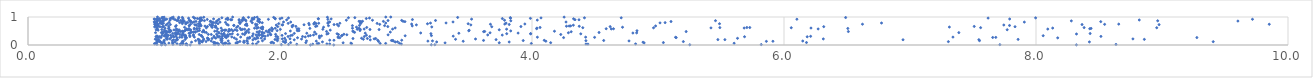
| Category | Series 0 |
|---|---|
| 2.241578945946104 | 0.001 |
| 2.426759971176793 | 0.002 |
| 1.2872069128105674 | 0.003 |
| 1.2631701502655523 | 0.004 |
| 8.320751555674372 | 0.005 |
| 1.0583924325847105 | 0.006 |
| 5.2523349750351 | 0.007 |
| 3.2008425112871373 | 0.008 |
| 3.229158893183101 | 0.009 |
| 1.0912658916119995 | 0.01 |
| 7.7133533990033545 | 0.011 |
| 2.010890504526307 | 0.012 |
| 50.19873191421325 | 0.013 |
| 1.2536540028273206 | 0.014 |
| 5.819514119680061 | 0.015 |
| 2.067765806990562 | 0.016 |
| 1.5117703901667539 | 0.017 |
| 1.207424003496214 | 0.018 |
| 1.064102342438244 | 0.019 |
| 1.210257160159444 | 0.02 |
| 8.634813253540578 | 0.021 |
| 1.0234598263853283 | 0.022 |
| 1.1504505991301899 | 0.023 |
| 13.195162578671912 | 0.024 |
| 1.4759752793500893 | 0.025 |
| 2.1330096976840323 | 0.026 |
| 1.2257277541115448 | 0.027 |
| 1.4852086224367906 | 0.028 |
| 2.260149794084783 | 0.029 |
| 1.085949907040457 | 0.03 |
| 4.444215818290673 | 0.031 |
| 1.5508420437927346 | 0.032 |
| 1.511578320611751 | 0.033 |
| 4.428578788481236 | 0.034 |
| 2.963239048578387 | 0.035 |
| 1.551490094915869 | 0.036 |
| 2.3947175451126963 | 0.037 |
| 1.0067952929091961 | 0.038 |
| 4.822104110397253 | 0.039 |
| 2.372178188229276 | 0.04 |
| 1.5883111105390662 | 0.041 |
| 1.8127985617609805 | 0.042 |
| 1.5656300615091177 | 0.043 |
| 1.182844893988606 | 0.044 |
| 1.7833207202650454 | 0.045 |
| 1.256074003803148 | 0.046 |
| 1.360942226552151 | 0.047 |
| 2.2954527707396895 | 0.048 |
| 2.5680618031354254 | 0.049 |
| 1.003904594621528 | 0.05 |
| 1.5999504683350616 | 0.051 |
| 16.922039974617455 | 0.052 |
| 3.9945782052346885 | 0.053 |
| 2.307301875399124 | 0.054 |
| 2.794912927505647 | 0.055 |
| 2.8385682186663903 | 0.056 |
| 29.256037089006174 | 0.057 |
| 1.7435041441675607 | 0.058 |
| 34.06864876100978 | 0.059 |
| 1.2304624885578006 | 0.06 |
| 1.5033032545507077 | 0.061 |
| 2.948320653457966 | 0.062 |
| 5.604247722702614 | 0.063 |
| 1.56214882009625 | 0.064 |
| 1.015541600178401 | 0.065 |
| 1.1182962540707286 | 0.066 |
| 1.1477723564848874 | 0.067 |
| 2.5625928142043017 | 0.068 |
| 1.2188776209100463 | 0.069 |
| 1.650035159258016 | 0.07 |
| 1.489650432981104 | 0.071 |
| 1.9492837424802816 | 0.072 |
| 1.5695515074345876 | 0.073 |
| 19.652979047435217 | 0.074 |
| 4.890045612627268 | 0.075 |
| 3.310096902760889 | 0.076 |
| 1.6606634178257913 | 0.077 |
| 2.501045547357235 | 0.078 |
| 3.740189222567471 | 0.079 |
| 24.34364476736399 | 0.08 |
| 1.0661555267974518 | 0.081 |
| 4.148106391566777 | 0.082 |
| 1.6586961973738166 | 0.083 |
| 1.9287221939685744 | 0.084 |
| 2.2051407270092707 | 0.085 |
| 2.0843348742267342 | 0.086 |
| 5.042739369853276 | 0.087 |
| 6.178378584180651 | 0.088 |
| 1.4808605368828305 | 0.089 |
| 1.1491125698770308 | 0.09 |
| 11.32301817452026 | 0.091 |
| 1.0543326818131804 | 0.092 |
| 2.0389634692496936 | 0.093 |
| 1.0798377728266342 | 0.094 |
| 1.53538078741684 | 0.095 |
| 1.4728068254868825 | 0.096 |
| 14.288463242025886 | 0.097 |
| 1.7167576450815947 | 0.098 |
| 2.0453070732026104 | 0.099 |
| 4.8812675264466305 | 0.1 |
| 1.7114771292230515 | 0.101 |
| 1.2979817800671 | 0.102 |
| 1.0241131724063892 | 0.103 |
| 1.9370839110490168 | 0.104 |
| 1.6655919512687074 | 0.105 |
| 1.166457976244932 | 0.106 |
| 2.915227450124975 | 0.107 |
| 3.8189099390880203 | 0.108 |
| 3.2434547920816263 | 0.109 |
| 8.423924668238275 | 0.11 |
| 2.337002338227638 | 0.111 |
| 1.3576951759346394 | 0.112 |
| 2.932423742795596 | 0.113 |
| 1.8270578497362433 | 0.114 |
| 1.3827290633594014 | 0.115 |
| 315.9405125009939 | 0.116 |
| 1.0231875278610503 | 0.117 |
| 1.3829931154784973 | 0.118 |
| 9.406533608315343 | 0.119 |
| 7.304599264926775 | 0.12 |
| 1.0474486672522987 | 0.121 |
| 5.201170105231243 | 0.122 |
| 1.0304107954277302 | 0.123 |
| 2.0252360327350294 | 0.124 |
| 1.4131399411857606 | 0.125 |
| 1.6815535610351564 | 0.126 |
| 2.782481341324616 | 0.127 |
| 1.2252194707116706 | 0.128 |
| 1.372520627104263 | 0.129 |
| 5.860229125459385 | 0.13 |
| 1.0478088144684023 | 0.131 |
| 1.7401401094504167 | 0.132 |
| 5.912134553105972 | 0.133 |
| 3.453973991855298 | 0.134 |
| 1.2326430226742646 | 0.135 |
| 4.110180671592021 | 0.136 |
| 30.96781560435631 | 0.137 |
| 2.2880344753904787 | 0.138 |
| 3.173903499075573 | 0.139 |
| 1.713591996622383 | 0.14 |
| 1.4542281575560472 | 0.141 |
| 6.148913083090953 | 0.142 |
| 1.0805028513456778 | 0.143 |
| 2.898707400257579 | 0.144 |
| 4.76999061134949 | 0.145 |
| 1.589279487209682 | 0.146 |
| 3.210103609329709 | 0.147 |
| 2.2103926321197136 | 0.148 |
| 1.539610572035262 | 0.149 |
| 12.680832238426122 | 0.15 |
| 1.8607416474073246 | 0.151 |
| 1.3299321408951414 | 0.152 |
| 1.9794214058089024 | 0.153 |
| 4.427950127714319 | 0.154 |
| 7.55156369182974 | 0.155 |
| 1.144271571972863 | 0.156 |
| 1.7365176288792192 | 0.157 |
| 3.930291142854737 | 0.158 |
| 1.03154126560061 | 0.159 |
| 2.8842976641002105 | 0.16 |
| 4.569034150588095 | 0.161 |
| 41.219547506348405 | 0.162 |
| 2.8945440332760475 | 0.163 |
| 3.6154542057263988 | 0.164 |
| 21.77388830740093 | 0.165 |
| 1.0805706572554266 | 0.166 |
| 4.097215089048692 | 0.167 |
| 2.7756978314723004 | 0.168 |
| 14.463917597014007 | 0.169 |
| 2.4281227256562956 | 0.17 |
| 2.966143795803339 | 0.171 |
| 2.394644446710003 | 0.172 |
| 2.0449054457597255 | 0.173 |
| 1.5304904998232234 | 0.174 |
| 1.1809142081598971 | 0.175 |
| 1.3921465388980987 | 0.176 |
| 1.022985993596122 | 0.177 |
| 1.1759780638923443 | 0.178 |
| 22.52546003630022 | 0.179 |
| 1.359627317873768 | 0.18 |
| 1.784653199381436 | 0.181 |
| 1.3543656152003944 | 0.182 |
| 2.7165147219747747 | 0.183 |
| 1.1560173174245445 | 0.184 |
| 2.1130493411798152 | 0.185 |
| 1.4326731775646167 | 0.186 |
| 6.944688669721129 | 0.187 |
| 10.523389172362885 | 0.188 |
| 1.4290518951367441 | 0.189 |
| 7.546542393605476 | 0.19 |
| 5.530965268879547 | 0.191 |
| 3.7149273978000714 | 0.192 |
| 5.475291454777098 | 0.193 |
| 1.186339158185072 | 0.194 |
| 1.9778364711136769 | 0.195 |
| 1.0212242633380324 | 0.196 |
| 1.960450261560182 | 0.197 |
| 1.2472832165452663 | 0.198 |
| 27.97029722714315 | 0.199 |
| 7.857933109102419 | 0.2 |
| 8.8598750510938 | 0.201 |
| 1.0383777853455118 | 0.202 |
| 1.4341928572968294 | 0.203 |
| 3.3933764177464876 | 0.204 |
| 2.661505719278479 | 0.205 |
| 1.3500132242380036 | 0.206 |
| 1.6541470289690585 | 0.207 |
| 1.0102922181910825 | 0.208 |
| 11.826309457727652 | 0.209 |
| 1.3947263334526605 | 0.21 |
| 1.1058201961613043 | 0.211 |
| 2.1709992285799076 | 0.212 |
| 1.1016447388418136 | 0.213 |
| 3.551872854629434 | 0.214 |
| 1.8778541450536481 | 0.215 |
| 1.8069939929287875 | 0.216 |
| 6.312054173989709 | 0.217 |
| 8.769333324877406 | 0.218 |
| 2.018445814113565 | 0.219 |
| 2.747239283032129 | 0.22 |
| 2.079497799555715 | 0.221 |
| 1.126030440542902 | 0.222 |
| 18.045375652783367 | 0.223 |
| 1.5304877537751138 | 0.224 |
| 34.568027385496684 | 0.225 |
| 14.209966877988537 | 0.226 |
| 16.997074292879475 | 0.227 |
| 1.5373234238025286 | 0.228 |
| 1.5420706171874334 | 0.229 |
| 2.7597097404085984 | 0.23 |
| 2.579224270434571 | 0.231 |
| 1.4607282173096445 | 0.232 |
| 2.6931422332957284 | 0.233 |
| 1.428367107289882 | 0.234 |
| 1.982595705433059 | 0.235 |
| 1.7959930592209044 | 0.236 |
| 1.0973523893897148 | 0.237 |
| 5.631099313612223 | 0.238 |
| 13.871942037728546 | 0.239 |
| 37.99783788422421 | 0.24 |
| 2.037330892783408 | 0.241 |
| 2.6473980937862254 | 0.242 |
| 1.7497983673888973 | 0.243 |
| 1.4904790244926645 | 0.244 |
| 1.850345638519614 | 0.245 |
| 1.8242464889377852 | 0.246 |
| 1.7581554714797423 | 0.247 |
| 1.742542503680825 | 0.248 |
| 12.661911161431837 | 0.249 |
| 1.4245540765668383 | 0.25 |
| 1.1828445572543993 | 0.251 |
| 25.81402460807473 | 0.252 |
| 1.6374384821490366 | 0.253 |
| 21.722036073636964 | 0.254 |
| 8.172250674215858 | 0.255 |
| 2.3134891974460174 | 0.256 |
| 1.1045274827017497 | 0.257 |
| 1.2583112346711909 | 0.258 |
| 2.1391912606380186 | 0.259 |
| 2.4748293870171203 | 0.26 |
| 1.5737351892938818 | 0.261 |
| 1.2511368052637935 | 0.262 |
| 5.144479643358682 | 0.263 |
| 4.25073086501913 | 0.264 |
| 2.461903520593512 | 0.265 |
| 9.276853890850184 | 0.266 |
| 10.342338088006748 | 0.267 |
| 1.0557623698935992 | 0.268 |
| 7.656343473767365 | 0.269 |
| 1.0297332732873874 | 0.27 |
| 1.7597975202437286 | 0.271 |
| 7.6808899314185854 | 0.272 |
| 4.496685044033712 | 0.273 |
| 1.1376108154213178 | 0.274 |
| 5.139481896144497 | 0.275 |
| 1.2220632340642907 | 0.276 |
| 1.2042345398544005 | 0.277 |
| 1.4781328399992193 | 0.278 |
| 4.042726732558227 | 0.279 |
| 4.425825094563069 | 0.28 |
| 1.3861679582345854 | 0.281 |
| 7.341021290860612 | 0.282 |
| 1.3203698617346684 | 0.283 |
| 1.6878349202079714 | 0.284 |
| 1.8172691089716193 | 0.285 |
| 1.5089631954671985 | 0.286 |
| 1.1583105413809405 | 0.287 |
| 2.2008366876772194 | 0.288 |
| 1.6170463662874959 | 0.289 |
| 1.2473652642509836 | 0.29 |
| 1.5735402600416661 | 0.291 |
| 2.461435486394946 | 0.292 |
| 1.5631301022408153 | 0.293 |
| 6.184204490677558 | 0.294 |
| 1.9803559587365385 | 0.295 |
| 5.686882717979698 | 0.296 |
| 1.015187688312971 | 0.297 |
| 1.0305712240011902 | 0.298 |
| 1.0445198898313626 | 0.299 |
| 1.2851415927498588 | 0.3 |
| 2.7127621260044816 | 0.301 |
| 2.669279628235043 | 0.302 |
| 2.1792758923581648 | 0.303 |
| 2.0641511828380374 | 0.304 |
| 1.521334947652717 | 0.305 |
| 1.9677585612472561 | 0.306 |
| 8.515454020819718 | 0.307 |
| 1.8822194264999932 | 0.308 |
| 1.8615887635484183 | 0.309 |
| 6.211394505854669 | 0.31 |
| 1.5416827407065552 | 0.311 |
| 222.47859723426097 | 0.312 |
| 1.5876606901769892 | 0.313 |
| 1.174574949706975 | 0.314 |
| 1.475245811018593 | 0.315 |
| 3.3747194159716507 | 0.316 |
| 1.0887517960106035 | 0.317 |
| 2.312228804988674 | 0.318 |
| 1.251563000600865 | 0.319 |
| 1.5038814847561695 | 0.32 |
| 1.1026852769241464 | 0.321 |
| 2.225165928838119 | 0.322 |
| 1.7811953815149157 | 0.323 |
| 1.023280588115598 | 0.324 |
| 1.0812544153385168 | 0.325 |
| 2.3287694755284485 | 0.326 |
| 1.152356059969554 | 0.327 |
| 2.4883364501345984 | 0.328 |
| 2.9933223601619066 | 0.329 |
| 1.5709260867979304 | 0.33 |
| 1.3129969897683764 | 0.331 |
| 8.057013451502012 | 0.332 |
| 1.3747471368297808 | 0.333 |
| 2.0837920697533785 | 0.334 |
| 3.202033843955892 | 0.335 |
| 1.8666356470863328 | 0.336 |
| 2.240801536671383 | 0.337 |
| 1.3766948843006634 | 0.338 |
| 1.284084925670883 | 0.339 |
| 1.0626810179198043 | 0.34 |
| 1.1136152822530183 | 0.341 |
| 1.9041291446405035 | 0.342 |
| 2.016360263534676 | 0.343 |
| 2.4936648984635306 | 0.344 |
| 1.2204516872044509 | 0.345 |
| 954.350037426929 | 0.346 |
| 1.2492051411307168 | 0.347 |
| 1.8365114072487763 | 0.348 |
| 2.685748991788226 | 0.349 |
| 1.1322420640223216 | 0.35 |
| 12.657415038546187 | 0.351 |
| 2.0977905590843737 | 0.352 |
| 1.2360323693348936 | 0.353 |
| 3.763932626525988 | 0.354 |
| 67.77356711913288 | 0.355 |
| 1.8279933316603978 | 0.356 |
| 2.2657948473350187 | 0.357 |
| 46.19616094633234 | 0.358 |
| 11.255419469976733 | 0.359 |
| 3.648618633102158 | 0.36 |
| 12.856850414398215 | 0.361 |
| 1.8095405052678524 | 0.362 |
| 2.8579070746192623 | 0.363 |
| 1.927395784445666 | 0.364 |
| 1.5505380689187953 | 0.365 |
| 2.5306481265712226 | 0.366 |
| 1.1016097073062534 | 0.367 |
| 1.8533323673568034 | 0.368 |
| 1.3133151179935194 | 0.369 |
| 1.5856041136107677 | 0.37 |
| 21.287120869517192 | 0.371 |
| 1.6647809052632767 | 0.372 |
| 1.7187523544747012 | 0.373 |
| 2.464234694266321 | 0.374 |
| 1.3593453532041009 | 0.375 |
| 4.228355862487969 | 0.376 |
| 1.4544728261001085 | 0.377 |
| 1.089729307159169 | 0.378 |
| 1.2050581326366756 | 0.379 |
| 1.4309275697959578 | 0.38 |
| 1.9651663294918098 | 0.381 |
| 1.5575775438758601 | 0.382 |
| 1.602805814591775 | 0.383 |
| 449.46277261798593 | 0.384 |
| 14.019056174182634 | 0.385 |
| 2.5074362413344735 | 0.386 |
| 1.1763933923757708 | 0.387 |
| 1.496700163501671 | 0.388 |
| 1.9237848656869276 | 0.389 |
| 2.3719823337958554 | 0.39 |
| 1.2307240681906095 | 0.391 |
| 1.1699651500053816 | 0.392 |
| 8.321233662691105 | 0.393 |
| 1.1851448505553188 | 0.394 |
| 2.2864111475323172 | 0.395 |
| 1.7031054032689763 | 0.396 |
| 1.0975725818213935 | 0.397 |
| 4.38715458688762 | 0.398 |
| 1.7866787093660408 | 0.399 |
| 1.6213430440705927 | 0.4 |
| 3.989040583007793 | 0.401 |
| 1.5349774761791168 | 0.402 |
| 2.4530389924318916 | 0.403 |
| 3.7993678074566146 | 0.404 |
| 3.197873621818967 | 0.405 |
| 3.989187714598837 | 0.406 |
| 2.0440118391999555 | 0.407 |
| 1.0686500233173508 | 0.408 |
| 1.1792902500868503 | 0.409 |
| 8.429738750930138 | 0.41 |
| 2.3821204624101284 | 0.411 |
| 1.1490310526940712 | 0.412 |
| 1.2284173610441689 | 0.413 |
| 52.78122293630901 | 0.414 |
| 2.1135727760606398 | 0.415 |
| 20.98050190751163 | 0.416 |
| 1.5548514726190519 | 0.417 |
| 1.2780873245710376 | 0.418 |
| 3.4195649007713356 | 0.419 |
| 35.37058652232841 | 0.42 |
| 2.21269094389322 | 0.421 |
| 1.285025009335026 | 0.422 |
| 1.5148627611054197 | 0.423 |
| 2.6765472059039386 | 0.424 |
| 1.191522477257588 | 0.425 |
| 3.889795784328582 | 0.426 |
| 1.8315827069966368 | 0.427 |
| 4.8008102832677535 | 0.428 |
| 11.474429085101676 | 0.429 |
| 3.116633808979 | 0.43 |
| 1.8740806578445526 | 0.431 |
| 1.7296892935843873 | 0.432 |
| 4.830570119008707 | 0.433 |
| 15.748739109441363 | 0.434 |
| 13.759840579811558 | 0.435 |
| 3.6671221738582207 | 0.436 |
| 4.288826963327457 | 0.437 |
| 1.1699987849729219 | 0.438 |
| 1.0707979292988314 | 0.439 |
| 1.0120909952354247 | 0.44 |
| 1.0584553431427404 | 0.441 |
| 7.387628691472769 | 0.442 |
| 1.8558953514786665 | 0.443 |
| 14.44651851612584 | 0.444 |
| 10.545458924895243 | 0.445 |
| 1.4151966367355882 | 0.446 |
| 4.532155612873871 | 0.447 |
| 1.2900487519821777 | 0.448 |
| 1.752341938112793 | 0.449 |
| 1.8609499736728992 | 0.45 |
| 1.5138035729471695 | 0.451 |
| 2.591958504761164 | 0.452 |
| 1.7265846145425587 | 0.453 |
| 1.905363761469129 | 0.454 |
| 65.370924551353 | 0.455 |
| 1.3004706583190884 | 0.456 |
| 1.100402911199 | 0.457 |
| 1.3269942870217568 | 0.458 |
| 1.9156598544251724 | 0.459 |
| 2.274671041464151 | 0.46 |
| 2.8755464383380054 | 0.461 |
| 1.12341170807721 | 0.462 |
| 1.4000830881133328 | 0.463 |
| 1.0681927635162685 | 0.464 |
| 1.3145132367247796 | 0.465 |
| 1.8181508080289397 | 0.466 |
| 258.0624215053049 | 0.467 |
| 25.15131639923706 | 0.468 |
| 1.3842482279560118 | 0.469 |
| 46.17430687312535 | 0.47 |
| 1.3289885066080567 | 0.471 |
| 1.104481374848459 | 0.472 |
| 4.310934977478623 | 0.473 |
| 1.1166324786484503 | 0.474 |
| 2.583937982169252 | 0.475 |
| 1.2329030352146366 | 0.476 |
| 3.615872835993812 | 0.477 |
| 1.2091481706106586 | 0.478 |
| 1.0844453063939827 | 0.479 |
| 5.223488138984881 | 0.48 |
| 6.510858683239888 | 0.481 |
| 1.1931000702258392 | 0.482 |
| 3.6247082879885957 | 0.483 |
| 2.3696072494759695 | 0.484 |
| 1.5900780546229167 | 0.485 |
| 1.2225728312708646 | 0.486 |
| 1.0914302971456915 | 0.487 |
| 1.1326861817423695 | 0.488 |
| 1.0973770935796985 | 0.489 |
| 1.83749320478334 | 0.49 |
| 1.2274135685881309 | 0.491 |
| 4.178171317264202 | 0.492 |
| 1.4818892076589167 | 0.493 |
| 1.499824123035733 | 0.494 |
| 1.3936406257053087 | 0.495 |
| 2.5775363823035247 | 0.496 |
| 1.3464870042186623 | 0.497 |
| 1.8904364355510808 | 0.498 |
| 1.6267228171544283 | 0.499 |
| 2.082296695169466 | 0.5 |
| 1.2421875274572214 | 0.501 |
| 1.736985407520652 | 0.502 |
| 3.831109698448022 | 0.503 |
| 11.410285029566737 | 0.504 |
| 1.936453752549187 | 0.505 |
| 1.5367234439415893 | 0.506 |
| 3.498528012297061 | 0.507 |
| 1.134093128228286 | 0.508 |
| 2.1502275622041482 | 0.509 |
| 4.83318393345509 | 0.51 |
| 10.857941087219547 | 0.511 |
| 2.1374391910182626 | 0.512 |
| 1.6006761833980026 | 0.513 |
| 1.977120339973568 | 0.514 |
| 2.634736391846923 | 0.515 |
| 31.44659156328469 | 0.516 |
| 69.36613966796327 | 0.517 |
| 1.6591889242253641 | 0.518 |
| 103.06469216109765 | 0.519 |
| 1.3610102822196397 | 0.52 |
| 1.176960869979283 | 0.521 |
| 1.1291561833246615 | 0.522 |
| 1.911504191371832 | 0.523 |
| 1.3927552318030851 | 0.524 |
| 1.5595810528007226 | 0.525 |
| 1.2482173056123622 | 0.526 |
| 3.5011793583967834 | 0.527 |
| 1.5444726784681937 | 0.528 |
| 1.0326072848439314 | 0.529 |
| 1.5641231605383403 | 0.53 |
| 2.398887846476906 | 0.531 |
| 91.4037342155743 | 0.532 |
| 1.0825122348046983 | 0.533 |
| 1.5707056630422647 | 0.534 |
| 1.287061889676077 | 0.535 |
| 1.2695501785283267 | 0.536 |
| 1.2005137469318252 | 0.537 |
| 1.158844446594108 | 0.538 |
| 1.2916809085535086 | 0.539 |
| 1.1905192372419109 | 0.54 |
| 1.0172323472260147 | 0.541 |
| 1.1234067751663384 | 0.542 |
| 3.740033908536719 | 0.543 |
| 1.64308163494589 | 0.544 |
| 7.771299107370565 | 0.545 |
| 1.6912184147839144 | 0.546 |
| 1.2558173480295056 | 0.547 |
| 47.06374071056184 | 0.548 |
| 1.614925467069492 | 0.549 |
| 1.9199392967986102 | 0.55 |
| 1.0617809782481844 | 0.551 |
| 2.7865414803036863 | 0.552 |
| 2.7140974200886125 | 0.553 |
| 618.8942651159871 | 0.554 |
| 1.7520029967024993 | 0.555 |
| 1.5960131351554956 | 0.556 |
| 2.6376521848343386 | 0.557 |
| 2.0027579552043906 | 0.558 |
| 1.7031821194265186 | 0.559 |
| 1.0288865264382798 | 0.56 |
| 2.340074046805521 | 0.561 |
| 2.612959744428391 | 0.562 |
| 13.69975953749935 | 0.563 |
| 1.7194935529120803 | 0.564 |
| 3.7983636920447705 | 0.565 |
| 1.8612927850478311 | 0.566 |
| 1.9417995275645021 | 0.567 |
| 2.8934495956567634 | 0.568 |
| 8.093502414498712 | 0.569 |
| 1.3197834759813807 | 0.57 |
| 2.667956697799121 | 0.571 |
| 1.3387564448199643 | 0.572 |
| 6.270997813028308 | 0.573 |
| 4.629220887631744 | 0.574 |
| 1.178186904679818 | 0.575 |
| 1.258623786491217 | 0.576 |
| 1.5041222125886944 | 0.577 |
| 2.1357888587061957 | 0.578 |
| 4.646718349538695 | 0.579 |
| 2.149564416801012 | 0.58 |
| 4.58876012461492 | 0.581 |
| 8.426731687786125 | 0.582 |
| 4.036760094969645 | 0.583 |
| 1.859141254919239 | 0.584 |
| 53.20093658245231 | 0.585 |
| 1.2773374533288164 | 0.586 |
| 1.114870726396627 | 0.587 |
| 1.359583854189725 | 0.588 |
| 35.40772699260363 | 0.589 |
| 1.3407756776730797 | 0.59 |
| 6.506631461017884 | 0.591 |
| 8.437103345668111 | 0.592 |
| 2.2372345173066552 | 0.593 |
| 1.6835244141641736 | 0.594 |
| 1.8163522697539582 | 0.595 |
| 1.3195334095555642 | 0.596 |
| 2.626893779200524 | 0.597 |
| 1.9622074068525708 | 0.598 |
| 1.0874424102852942 | 0.599 |
| 2.5753134022785025 | 0.6 |
| 1.7981350230384616 | 0.601 |
| 1.0223670200459216 | 0.602 |
| 1.532858217344864 | 0.603 |
| 8.13239887614177 | 0.604 |
| 4.03930830231159 | 0.605 |
| 6.214235140988989 | 0.606 |
| 5.683748670839552 | 0.607 |
| 1.8473968125690525 | 0.608 |
| 1.93411384721362 | 0.609 |
| 2.9141531043662527 | 0.61 |
| 5.420440630423979 | 0.611 |
| 1.1189713898960063 | 0.612 |
| 4.96462268829103 | 0.613 |
| 1.415429979618498 | 0.614 |
| 16.184202190763326 | 0.615 |
| 6.057706570132798 | 0.616 |
| 8.958184426775501 | 0.617 |
| 4.403265418967338 | 0.618 |
| 7.560566450754984 | 0.619 |
| 18.585649005835222 | 0.62 |
| 5.490943105747998 | 0.621 |
| 8.381859582748687 | 0.622 |
| 5.72854774349844 | 0.623 |
| 1.825661250359211 | 0.624 |
| 5.705433116611426 | 0.625 |
| 4.064124790958699 | 0.626 |
| 2.6883789334154864 | 0.627 |
| 1.4618161133045426 | 0.628 |
| 27.968410872209176 | 0.629 |
| 1.8629750570624082 | 0.63 |
| 1.655960686078448 | 0.631 |
| 1.2426579694042468 | 0.632 |
| 21.472469317319334 | 0.633 |
| 4.718547899331978 | 0.634 |
| 10.468586979533336 | 0.635 |
| 2.345807779237798 | 0.636 |
| 1.4862352327237345 | 0.637 |
| 2.6071192722645327 | 0.638 |
| 1.021150470492697 | 0.639 |
| 36.351160894717225 | 0.64 |
| 7.3126213279732175 | 0.641 |
| 1.492137670929958 | 0.642 |
| 1.8602353646389274 | 0.643 |
| 60.63318882494365 | 0.644 |
| 3.204733746132459 | 0.645 |
| 50.63117109629223 | 0.646 |
| 1.0049473839605267 | 0.647 |
| 1.0700573163686269 | 0.648 |
| 1.066438525141431 | 0.649 |
| 12.61791082305382 | 0.65 |
| 2.096940338522089 | 0.651 |
| 3.6807671802962965 | 0.652 |
| 1.0481410315252015 | 0.653 |
| 7.833636367179537 | 0.654 |
| 6.3154287381748775 | 0.655 |
| 1.9817236082951193 | 0.656 |
| 4.620205194622324 | 0.657 |
| 2.8557145474256487 | 0.658 |
| 3.9120168300397946 | 0.659 |
| 1.4242849148106829 | 0.66 |
| 1.4567156507089796 | 0.661 |
| 1.1709640901036036 | 0.662 |
| 2.282274558650305 | 0.663 |
| 7.509714236080297 | 0.664 |
| 2.126064474969904 | 0.665 |
| 12.479880023154045 | 0.666 |
| 1.0360816528275385 | 0.667 |
| 1.0752620077401722 | 0.668 |
| 4.374976338157038 | 0.669 |
| 1.6662850211510705 | 0.67 |
| 4.273561905746814 | 0.671 |
| 10.119284598962484 | 0.672 |
| 1.3534107670305255 | 0.673 |
| 1.1161697677958602 | 0.674 |
| 14.685276357214926 | 0.675 |
| 1.4048122827801184 | 0.676 |
| 2.292852590675656 | 0.677 |
| 4.294770282393349 | 0.678 |
| 46.636488471071 | 0.679 |
| 4.980939239467178 | 0.68 |
| 4.306609684726484 | 0.681 |
| 3.0495965298023986 | 0.682 |
| 1.3672664260216127 | 0.683 |
| 2.464549895219879 | 0.684 |
| 1.8101410503355297 | 0.685 |
| 1.2796619962615847 | 0.686 |
| 1.3739297610174892 | 0.687 |
| 2.0969900179489094 | 0.688 |
| 1.487925480151955 | 0.689 |
| 2.384871039047925 | 0.69 |
| 2.830179512383738 | 0.691 |
| 2.574839800971848 | 0.692 |
| 1.1765180216248214 | 0.693 |
| 1.0124782468309363 | 0.694 |
| 1.2803715100400272 | 0.695 |
| 1.6330854479557795 | 0.696 |
| 1.7380687089097961 | 0.697 |
| 7.789854924074679 | 0.698 |
| 2.6305724412011844 | 0.699 |
| 1.4675406545336918 | 0.7 |
| 1.4578847388796508 | 0.701 |
| 1.3355454642625015 | 0.702 |
| 2.104004894942781 | 0.703 |
| 10.128093983604481 | 0.704 |
| 1.6342682421485486 | 0.705 |
| 16.4342901201447 | 0.706 |
| 4.328146092386389 | 0.707 |
| 83.44374712626008 | 0.708 |
| 1.0319922247836943 | 0.709 |
| 1.0948929094537274 | 0.71 |
| 1.5889808309333373 | 0.711 |
| 1.9702775349643367 | 0.712 |
| 1.0240993803514995 | 0.713 |
| 7.744692555387317 | 0.714 |
| 53.73882489164866 | 0.715 |
| 1.7252009135171196 | 0.716 |
| 3.5147236059827973 | 0.717 |
| 3.082428673751191 | 0.718 |
| 2.021302441014699 | 0.719 |
| 2.0168441583326033 | 0.72 |
| 2.2319532413025382 | 0.721 |
| 1.3339965408262313 | 0.722 |
| 2.190775877957194 | 0.723 |
| 1.3238235483879575 | 0.724 |
| 1.732745546215308 | 0.725 |
| 1.4431226442146832 | 0.726 |
| 8.976829260989836 | 0.727 |
| 1.818203464401669 | 0.728 |
| 2.429064689881514 | 0.729 |
| 8.365462229943066 | 0.73 |
| 1.129879868935262 | 0.731 |
| 1.3672623787347622 | 0.732 |
| 3.819071215108864 | 0.733 |
| 1.0327997180187705 | 0.734 |
| 2.4534471704666627 | 0.735 |
| 1.0057802295809637 | 0.736 |
| 2.7914270335277345 | 0.737 |
| 8.544701390061109 | 0.738 |
| 1.5778445559442982 | 0.739 |
| 9.851436499322062 | 0.74 |
| 3.670098991346285 | 0.741 |
| 1.2900684588789426 | 0.742 |
| 6.622743255269863 | 0.743 |
| 1.8060464295844165 | 0.744 |
| 40.28720739956167 | 0.745 |
| 8.656628694736003 | 0.746 |
| 3.7840041013980295 | 0.747 |
| 3.0446961302938855 | 0.748 |
| 15.699914222811872 | 0.749 |
| 3.943298476616974 | 0.75 |
| 2.2683063370323358 | 0.751 |
| 1.4602653685308595 | 0.752 |
| 1.2518746624829868 | 0.753 |
| 1.1063228882074045 | 0.754 |
| 1.7345893355700597 | 0.755 |
| 1.0642956901623815 | 0.756 |
| 1.3644192488249323 | 0.757 |
| 3.170497293442901 | 0.758 |
| 3.493317848437993 | 0.759 |
| 5.488296666092975 | 0.76 |
| 1.5083836892339948 | 0.761 |
| 1.3524125443487636 | 0.762 |
| 1.9894544134125438 | 0.763 |
| 1.225128381422235 | 0.764 |
| 2.2860710582722428 | 0.765 |
| 1.6820385658325776 | 0.766 |
| 2.271867684761987 | 0.767 |
| 1.065702978365067 | 0.768 |
| 2.6409640619660673 | 0.769 |
| 1.0083045427809723 | 0.77 |
| 2.7708467568508146 | 0.771 |
| 2.2284812270907226 | 0.772 |
| 2.0649491013846863 | 0.773 |
| 2.3802882661978124 | 0.774 |
| 1.0656302461951348 | 0.775 |
| 2.4750178309635293 | 0.776 |
| 2.3071019851489196 | 0.777 |
| 1.0481050363837126 | 0.778 |
| 1.0748060128971009 | 0.779 |
| 3.794006395882641 | 0.78 |
| 14.295692630601986 | 0.781 |
| 1.02419699688348 | 0.782 |
| 3.194230481888908 | 0.783 |
| 2.8391847335356126 | 0.784 |
| 6.7740722139428895 | 0.785 |
| 1.2514039271652315 | 0.786 |
| 3.3178764475461873 | 0.787 |
| 1.0530555732787668 | 0.788 |
| 26.788515876465667 | 0.789 |
| 5.016082837656413 | 0.79 |
| 49.44011189032796 | 0.791 |
| 1.4931922212127604 | 0.792 |
| 2.6367935806566662 | 0.793 |
| 1.257486438986437 | 0.794 |
| 1.8589865973780153 | 0.795 |
| 1.7796784027352905 | 0.796 |
| 1.3055917117770672 | 0.797 |
| 1.2035074802161327 | 0.798 |
| 5.056497155778828 | 0.799 |
| 1.474672885014624 | 0.8 |
| 129.60767099021575 | 0.801 |
| 2.2751187240615196 | 0.802 |
| 2.3819709848483024 | 0.803 |
| 1.2683568644816867 | 0.804 |
| 1.1195954728152522 | 0.805 |
| 1.8382723406152521 | 0.806 |
| 19.84735546392473 | 0.807 |
| 1.5675234284091477 | 0.808 |
| 1.6772500707003464 | 0.809 |
| 1.6870895586222914 | 0.81 |
| 1.008825201866005 | 0.811 |
| 48.40027931482256 | 0.812 |
| 10.349862919759218 | 0.813 |
| 27.13228738722817 | 0.814 |
| 1.2215381910108072 | 0.815 |
| 1.5241123191941073 | 0.816 |
| 2.644452497663819 | 0.817 |
| 7.907518667790685 | 0.818 |
| 2.085095087850212 | 0.819 |
| 1.4604599994120282 | 0.82 |
| 4.270096289546036 | 0.821 |
| 2.0281133060870133 | 0.822 |
| 3.373213797660902 | 0.823 |
| 2.3943940985512406 | 0.824 |
| 1.0016775176418962 | 0.825 |
| 1.2902724081908017 | 0.826 |
| 23.2326418662063 | 0.827 |
| 1.0508466716346432 | 0.828 |
| 23.060890838446454 | 0.829 |
| 1.3181643312729838 | 0.83 |
| 1.8367431651559403 | 0.831 |
| 1.232467229897339 | 0.832 |
| 49.67356128927061 | 0.833 |
| 8.513962151172478 | 0.834 |
| 2.99172531920873 | 0.835 |
| 1.018486225334609 | 0.836 |
| 1.3635780597002098 | 0.837 |
| 5.103345514864781 | 0.838 |
| 1.0641545165209774 | 0.839 |
| 2.6396721318655705 | 0.84 |
| 1.3332657283611284 | 0.841 |
| 1.4464872101373745 | 0.842 |
| 1.0264960185832683 | 0.843 |
| 2.820586540921889 | 0.844 |
| 2.976959889861392 | 0.845 |
| 1.3650221541642222 | 0.846 |
| 1.4493044420521979 | 0.847 |
| 2.654903627724682 | 0.848 |
| 2.6274181765417697 | 0.849 |
| 1.4961102905648576 | 0.85 |
| 1.7699808644749675 | 0.851 |
| 1.240387476379154 | 0.852 |
| 1.0724428487942734 | 0.853 |
| 12.457277872107992 | 0.854 |
| 9.602515573344052 | 0.855 |
| 1.8227552216854406 | 0.856 |
| 1.2891136652798776 | 0.857 |
| 1.2900568582342045 | 0.858 |
| 1.2265184538586913 | 0.859 |
| 104.5966194361669 | 0.86 |
| 8.280482567891893 | 0.861 |
| 1.729899967667613 | 0.862 |
| 3.8319202420482226 | 0.863 |
| 8.965791575055768 | 0.864 |
| 1.7013978264101342 | 0.865 |
| 30.758675811488292 | 0.866 |
| 1.07134154641405 | 0.867 |
| 1.0726141908333418 | 0.868 |
| 5.456369765710033 | 0.869 |
| 1.4002281273814432 | 0.87 |
| 92.50448251169178 | 0.871 |
| 1.1824856503833072 | 0.872 |
| 2.857274691365011 | 0.873 |
| 1.1914333750195096 | 0.874 |
| 1.2114354432549703 | 0.875 |
| 3.234405254738623 | 0.876 |
| 55.16019694938418 | 0.877 |
| 1.5063344720746568 | 0.878 |
| 2.9659124222400117 | 0.879 |
| 1.029184927596122 | 0.88 |
| 18.377487009010615 | 0.881 |
| 1.6766016852500218 | 0.882 |
| 1.1267046802136298 | 0.883 |
| 2.7338005637921396 | 0.884 |
| 3.7819078874543823 | 0.885 |
| 2.5265344142347335 | 0.886 |
| 1.278562498241618 | 0.887 |
| 1.3807357811834347 | 0.888 |
| 4.041948064437257 | 0.889 |
| 1.024897694808277 | 0.89 |
| 1.0480668581278174 | 0.891 |
| 1.083433856918638 | 0.892 |
| 8.819666567437984 | 0.893 |
| 1.3759309110415323 | 0.894 |
| 1.72555969763876 | 0.895 |
| 29.166881145059616 | 0.896 |
| 2.0524885172970055 | 0.897 |
| 1.699564725630985 | 0.898 |
| 1.024055731258409 | 0.899 |
| 4.373015116769715 | 0.9 |
| 1.2293660155619364 | 0.901 |
| 1.6168666307206379 | 0.902 |
| 4.341275624248925 | 0.903 |
| 1.6084768067637292 | 0.904 |
| 1.16798744943567 | 0.905 |
| 1.6755086233787422 | 0.906 |
| 1.7787770699075034 | 0.907 |
| 3.051038451631273 | 0.908 |
| 19.22437008625732 | 0.909 |
| 1.8368985949464272 | 0.91 |
| 1.584799338574626 | 0.911 |
| 1.0057527985714207 | 0.912 |
| 1.4224913092538596 | 0.913 |
| 2.379984178189382 | 0.914 |
| 1.7135941503879486 | 0.915 |
| 1.9080235302646316 | 0.916 |
| 1.0172561382893868 | 0.917 |
| 9.718041211568009 | 0.918 |
| 1.088311542791424 | 0.919 |
| 6.102374648114494 | 0.92 |
| 1.5163393567013457 | 0.921 |
| 1.1006517467520223 | 0.922 |
| 3.5204802785958593 | 0.923 |
| 1.7917988165022882 | 0.924 |
| 1.5716463089321595 | 0.925 |
| 1.8262857005028252 | 0.926 |
| 1.587910241842509 | 0.927 |
| 1.3618001277249898 | 0.928 |
| 7.790984903225113 | 0.929 |
| 1.0013622484392344 | 0.93 |
| 2.4060362190301983 | 0.931 |
| 1.4728780734825602 | 0.932 |
| 1.1541176179665735 | 0.933 |
| 1.9626102119118276 | 0.934 |
| 4.330053168548686 | 0.935 |
| 2.304493036065615 | 0.936 |
| 1.0296245129730022 | 0.937 |
| 17.43600931885192 | 0.938 |
| 2.3041516403608613 | 0.939 |
| 2.0001957770305987 | 0.94 |
| 1.0435935157475371 | 0.941 |
| 1.1276644480444105 | 0.942 |
| 1.1932468029035235 | 0.943 |
| 3.7647189921674316 | 0.944 |
| 2.6851103711690407 | 0.945 |
| 1.0664510101485476 | 0.946 |
| 1.3438888520161718 | 0.947 |
| 1.5828123480469765 | 0.948 |
| 1.9606969908113339 | 0.949 |
| 1.3619377972804259 | 0.95 |
| 1.2293040427428013 | 0.951 |
| 3.9873226810007507 | 0.952 |
| 3.829347444470811 | 0.953 |
| 1.7797950793451898 | 0.954 |
| 1.3238163274893964 | 0.955 |
| 1.5844185780752644 | 0.956 |
| 1.7070668365734913 | 0.957 |
| 1.274448010046864 | 0.958 |
| 1.1367988776849989 | 0.959 |
| 1.320690070097774 | 0.96 |
| 7.61992498852818 | 0.961 |
| 2.0153832004539587 | 0.962 |
| 2.7099486666856065 | 0.963 |
| 1.1398169839964116 | 0.964 |
| 1.367605203603388 | 0.965 |
| 2.0670843285982037 | 0.966 |
| 1.3757106668092165 | 0.967 |
| 4.071524115136294 | 0.968 |
| 7.996876249634014 | 0.969 |
| 4.416379520698879 | 0.97 |
| 4.70801923070518 | 0.971 |
| 1.5387840819547303 | 0.972 |
| 2.5431639783978657 | 0.973 |
| 1.7091436626166794 | 0.974 |
| 1.0685714042214316 | 0.975 |
| 2.594010279207374 | 0.976 |
| 3.828077241505826 | 0.977 |
| 13.623952867477508 | 0.978 |
| 1.0633974339922414 | 0.979 |
| 11.980337802030087 | 0.98 |
| 6.489186528525326 | 0.981 |
| 1.797938491993871 | 0.982 |
| 1.0698389980392793 | 0.983 |
| 3.4100125915480604 | 0.984 |
| 1.2249187435989617 | 0.985 |
| 1.9499031004038323 | 0.986 |
| 1.7500520339960943 | 0.987 |
| 12.439850644036296 | 0.988 |
| 1.1962724333233752 | 0.989 |
| 2.376174085498003 | 0.99 |
| 1.3951065454483866 | 0.991 |
| 1.3122082232527712 | 0.992 |
| 1.0803254323540108 | 0.993 |
| 1.8187351709532613 | 0.994 |
| 1.1525805199748833 | 0.995 |
| 4.255064262760898 | 0.996 |
| 1.6243338339293738 | 0.997 |
| 2.8396266354852253 | 0.998 |
| 2.879208908706303 | 0.999 |
| 1.027714015262554 | 1 |